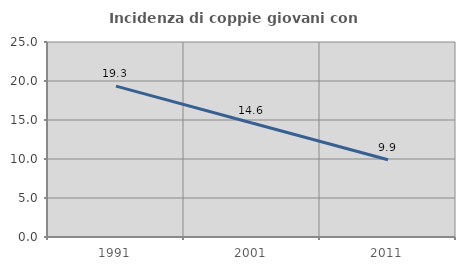
| Category | Incidenza di coppie giovani con figli |
|---|---|
| 1991.0 | 19.338 |
| 2001.0 | 14.615 |
| 2011.0 | 9.913 |